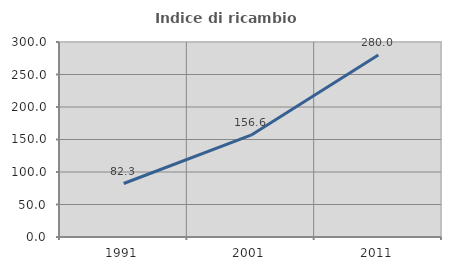
| Category | Indice di ricambio occupazionale  |
|---|---|
| 1991.0 | 82.301 |
| 2001.0 | 156.627 |
| 2011.0 | 280 |